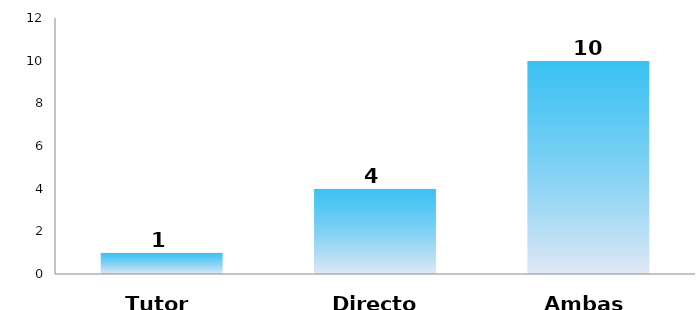
| Category | Series 0 |
|---|---|
| Tutor | 1 |
| Director | 4 |
| Ambas | 10 |